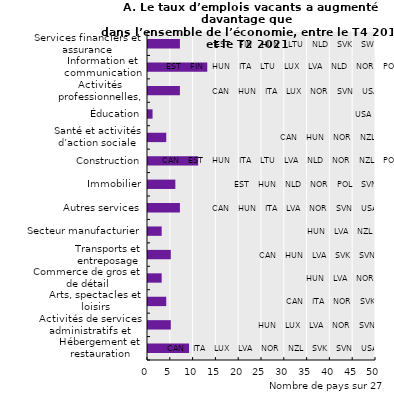
| Category | Nombre de pays | Labels SPOTS |
|---|---|---|
| Hébergement et restauration | 9 | 50 |
| Activités de services administratifs et d'appui | 5 | 50 |
| Arts, spectacles et loisirs | 4 | 50 |
| Commerce de gros et de détail | 3 | 50 |
| Transports et entreposage | 5 | 50 |
| Secteur manufacturier | 3 | 50 |
| Autres services | 7 | 50 |
| Immobilier | 6 | 50 |
| Construction | 11 | 50 |
| Santé et activités d’action sociale | 4 | 50 |
| Éducation | 1 | 50 |
| Activités professionnelles, scientifiques et techniques | 7 | 50 |
| Information et communication | 13 | 50 |
| Services financiers et assurance | 7 | 50 |